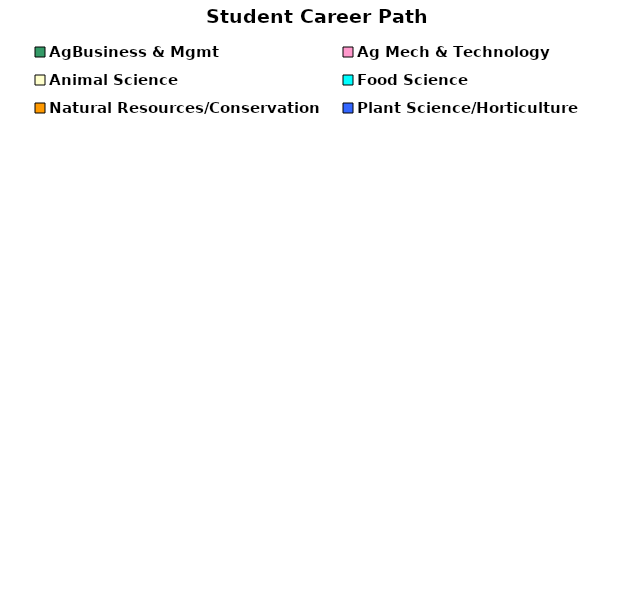
| Category | Series 0 |
|---|---|
| AgBusiness & Mgmt | 0 |
| Ag Mech & Technology | 0 |
| Animal Science | 0 |
| Food Science | 0 |
| Natural Resources/Conservation | 0 |
| Plant Science/Horticulture | 0 |